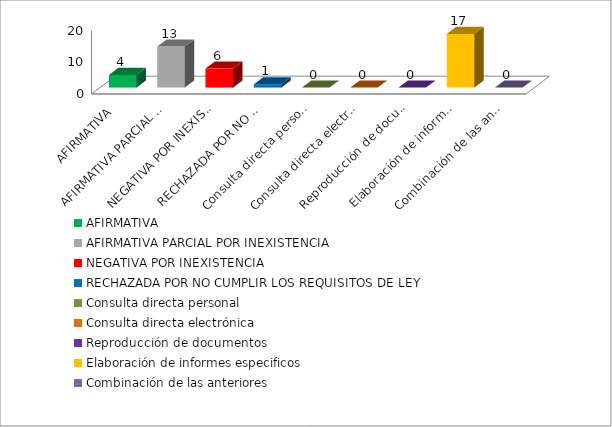
| Category | Series 3 |
|---|---|
| AFIRMATIVA | 4 |
| AFIRMATIVA PARCIAL POR INEXISTENCIA | 13 |
| NEGATIVA POR INEXISTENCIA | 6 |
| RECHAZADA POR NO CUMPLIR LOS REQUISITOS DE LEY | 1 |
| Consulta directa personal | 0 |
| Consulta directa electrónica | 0 |
| Reproducción de documentos | 0 |
| Elaboración de informes especificos | 17 |
| Combinación de las anteriores | 0 |